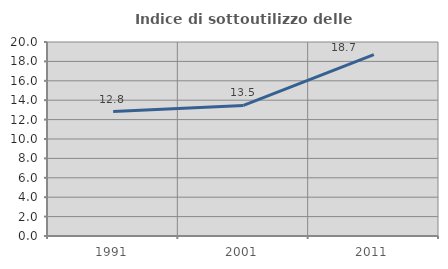
| Category | Indice di sottoutilizzo delle abitazioni  |
|---|---|
| 1991.0 | 12.832 |
| 2001.0 | 13.462 |
| 2011.0 | 18.696 |